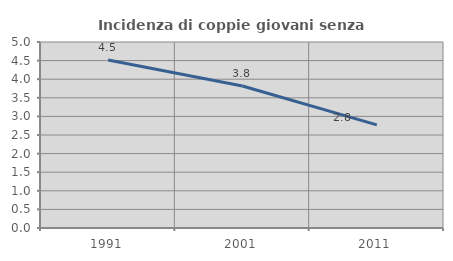
| Category | Incidenza di coppie giovani senza figli |
|---|---|
| 1991.0 | 4.516 |
| 2001.0 | 3.816 |
| 2011.0 | 2.771 |